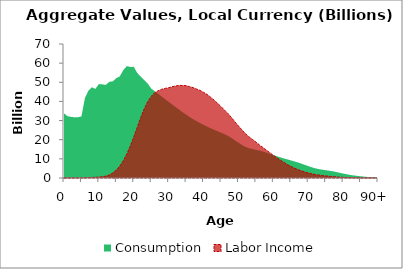
| Category | Consumption | Labor Income |
|---|---|---|
| 0 | 33765.833 | 0 |
|  | 32305.642 | 0 |
| 2 | 31929.683 | 1.298 |
| 3 | 31701.893 | 2.669 |
| 4 | 31747.611 | 4.518 |
| 5 | 32180.252 | 19.115 |
| 6 | 41792.106 | 95.687 |
| 7 | 45624.592 | 197.537 |
| 8 | 47422.405 | 295.009 |
| 9 | 46553.969 | 377.465 |
| 10 | 49075.619 | 480.207 |
| 11 | 48900.278 | 657.985 |
| 12 | 48675.086 | 984.441 |
| 13 | 50281.426 | 1596.856 |
| 14 | 50488.713 | 2639.519 |
| 15 | 52180.494 | 4170.288 |
| 16 | 53134.328 | 6266.941 |
| 17 | 56401.544 | 9027.118 |
| 18 | 58436.889 | 12495.092 |
| 19 | 58032.477 | 16686.732 |
| 20 | 58058.187 | 21422.326 |
| 21 | 54854.726 | 26486.355 |
| 22 | 52979.794 | 31602.387 |
| 23 | 51118.709 | 36147.064 |
| 24 | 49372.003 | 39895.507 |
| 25 | 46696.872 | 42641.349 |
| 26 | 45406.193 | 44536.603 |
| 27 | 43994.542 | 45595.751 |
| 28 | 42555.378 | 46360.536 |
| 29 | 41183.342 | 46810.398 |
| 30 | 39812.148 | 47177.007 |
| 31 | 38413.335 | 47663.857 |
| 32 | 37051.541 | 48082.707 |
| 33 | 35684.472 | 48348.058 |
| 34 | 34348.653 | 48322.137 |
| 35 | 33107.192 | 48247.845 |
| 36 | 31896.287 | 47729.115 |
| 37 | 30772.046 | 47198.797 |
| 38 | 29714.497 | 46470.402 |
| 39 | 28717.306 | 45781.22 |
| 40 | 27768.761 | 44768.479 |
| 41 | 26869.412 | 43672.247 |
| 42 | 26018.468 | 42255.252 |
| 43 | 25222.016 | 40715.913 |
| 44 | 24463.308 | 39053.111 |
| 45 | 23683.269 | 37322.282 |
| 46 | 22925.765 | 35503.506 |
| 47 | 22018.944 | 33670.48 |
| 48 | 20906.509 | 31586.842 |
| 49 | 19661.033 | 29336.555 |
| 50 | 18462.121 | 27178.548 |
| 51 | 17249.685 | 25155.254 |
| 52 | 16248.193 | 23165.05 |
| 53 | 15583.505 | 21554.772 |
| 54 | 15150.203 | 20180.053 |
| 55 | 14702.282 | 18807.139 |
| 56 | 14289.387 | 17301.289 |
| 57 | 13827.165 | 15970.178 |
| 58 | 13245.839 | 14591.357 |
| 59 | 12580.357 | 13190.167 |
| 60 | 11964.798 | 11813.113 |
| 61 | 11367.379 | 10573.036 |
| 62 | 10790.115 | 9344.776 |
| 63 | 10246.313 | 8168.631 |
| 64 | 9726.773 | 7064.092 |
| 65 | 9201.859 | 6095.442 |
| 66 | 8698.682 | 5215.837 |
| 67 | 8150.668 | 4436.464 |
| 68 | 7530.369 | 3757.022 |
| 69 | 6873.127 | 3177.864 |
| 70 | 6237.615 | 2667.837 |
| 71 | 5600.211 | 2229.29 |
| 72 | 5059.839 | 1863.743 |
| 73 | 4662.636 | 1557.729 |
| 74 | 4369.573 | 1312.675 |
| 75 | 4080.364 | 1105.605 |
| 76 | 3819.505 | 916.36 |
| 77 | 3520.456 | 743.43 |
| 78 | 3144.163 | 591.064 |
| 79 | 2718.322 | 447.092 |
| 80 | 2326.66 | 319.891 |
| 81 | 1953.137 | 225.546 |
| 82 | 1620.388 | 154.733 |
| 83 | 1347.115 | 107.577 |
| 84 | 1121.727 | 80.124 |
| 85 | 910.105 | 62.655 |
| 86 | 716.349 | 46.082 |
| 87 | 552.332 | 32.35 |
| 88 | 419.724 | 20.515 |
| 89 | 313.867 | 10.536 |
| 90+ | 645.544 | 11.729 |